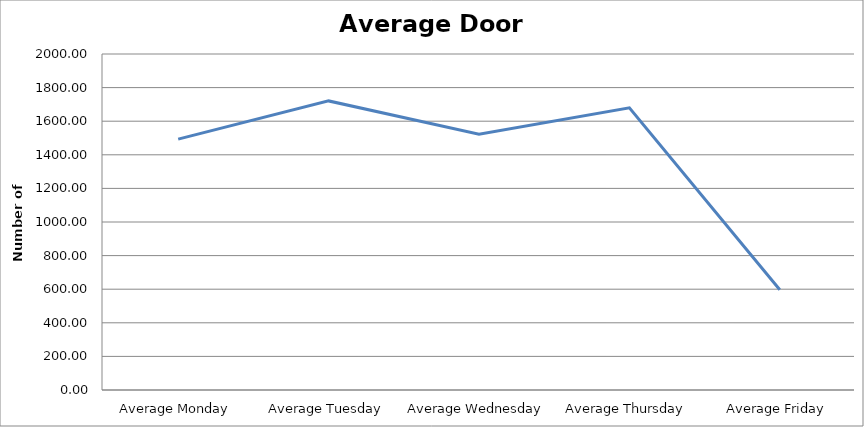
| Category | Series 0 |
|---|---|
| Average Monday | 1493.5 |
| Average Tuesday | 1720.75 |
| Average Wednesday | 1522.75 |
| Average Thursday | 1679.75 |
| Average Friday | 596.75 |